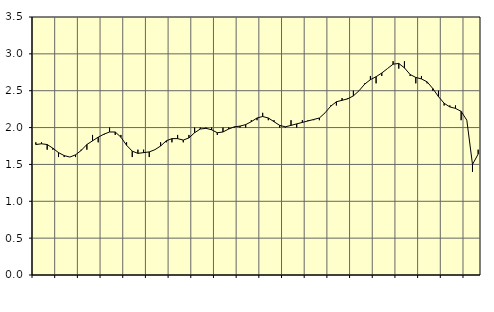
| Category | Piggar | Series 1 |
|---|---|---|
| nan | 1.8 | 1.77 |
| 1.0 | 1.8 | 1.78 |
| 1.0 | 1.7 | 1.77 |
| 1.0 | 1.7 | 1.72 |
| nan | 1.6 | 1.66 |
| 2.0 | 1.6 | 1.62 |
| 2.0 | 1.6 | 1.6 |
| 2.0 | 1.6 | 1.63 |
| nan | 1.7 | 1.69 |
| 3.0 | 1.7 | 1.77 |
| 3.0 | 1.9 | 1.82 |
| 3.0 | 1.8 | 1.87 |
| nan | 1.9 | 1.91 |
| 4.0 | 2 | 1.94 |
| 4.0 | 1.9 | 1.94 |
| 4.0 | 1.9 | 1.87 |
| nan | 1.8 | 1.76 |
| 5.0 | 1.6 | 1.68 |
| 5.0 | 1.7 | 1.65 |
| 5.0 | 1.7 | 1.66 |
| nan | 1.6 | 1.67 |
| 6.0 | 1.7 | 1.7 |
| 6.0 | 1.8 | 1.75 |
| 6.0 | 1.8 | 1.82 |
| nan | 1.8 | 1.85 |
| 7.0 | 1.9 | 1.85 |
| 7.0 | 1.8 | 1.83 |
| 7.0 | 1.9 | 1.86 |
| nan | 2 | 1.93 |
| 8.0 | 2 | 1.98 |
| 8.0 | 2 | 1.99 |
| 8.0 | 2 | 1.97 |
| nan | 1.9 | 1.93 |
| 9.0 | 2 | 1.94 |
| 9.0 | 2 | 1.98 |
| 9.0 | 2 | 2.01 |
| nan | 2 | 2.02 |
| 10.0 | 2 | 2.04 |
| 10.0 | 2.1 | 2.08 |
| 10.0 | 2.1 | 2.13 |
| nan | 2.2 | 2.15 |
| 11.0 | 2.1 | 2.13 |
| 11.0 | 2.1 | 2.08 |
| 11.0 | 2 | 2.03 |
| nan | 2 | 2.01 |
| 12.0 | 2.1 | 2.03 |
| 12.0 | 2 | 2.05 |
| 12.0 | 2.1 | 2.07 |
| nan | 2.1 | 2.09 |
| 13.0 | 2.1 | 2.11 |
| 13.0 | 2.1 | 2.13 |
| 13.0 | 2.2 | 2.2 |
| nan | 2.3 | 2.29 |
| 14.0 | 2.3 | 2.35 |
| 14.0 | 2.4 | 2.37 |
| 14.0 | 2.4 | 2.39 |
| nan | 2.5 | 2.43 |
| 15.0 | 2.5 | 2.5 |
| 15.0 | 2.6 | 2.59 |
| 15.0 | 2.7 | 2.65 |
| nan | 2.6 | 2.69 |
| 16.0 | 2.7 | 2.74 |
| 16.0 | 2.8 | 2.8 |
| 16.0 | 2.9 | 2.86 |
| nan | 2.8 | 2.87 |
| 17.0 | 2.9 | 2.81 |
| 17.0 | 2.7 | 2.72 |
| 17.0 | 2.6 | 2.68 |
| nan | 2.7 | 2.66 |
| 18.0 | 2.6 | 2.62 |
| 18.0 | 2.5 | 2.53 |
| 18.0 | 2.5 | 2.42 |
| nan | 2.3 | 2.33 |
| 19.0 | 2.3 | 2.28 |
| 19.0 | 2.3 | 2.26 |
| 19.0 | 2.1 | 2.22 |
| nan | 2.1 | 2.1 |
| 20.0 | 1.4 | 1.5 |
| 20.0 | 1.7 | 1.64 |